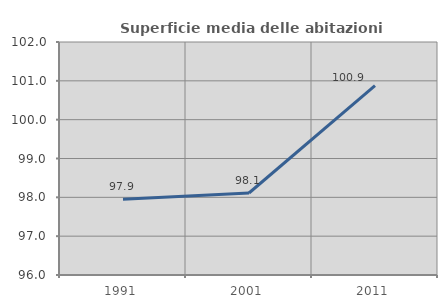
| Category | Superficie media delle abitazioni occupate |
|---|---|
| 1991.0 | 97.948 |
| 2001.0 | 98.112 |
| 2011.0 | 100.879 |